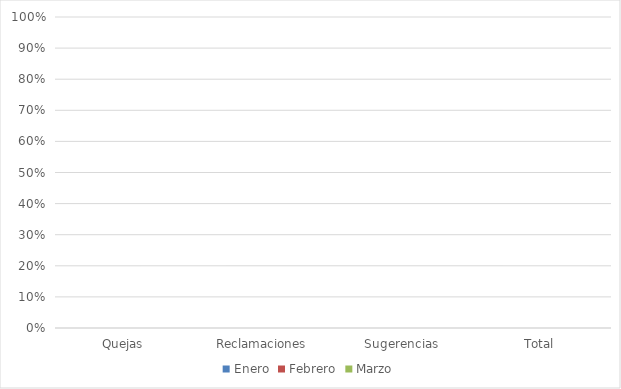
| Category | Enero | Febrero | Marzo |
|---|---|---|---|
| Quejas | 0 | 0 | 0 |
| Reclamaciones | 0 | 0 | 0 |
| Sugerencias | 0 | 0 | 0 |
| Total | 0 | 0 | 0 |